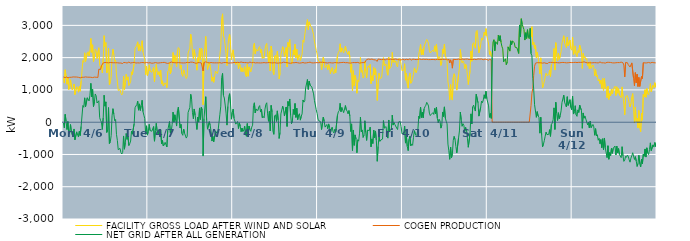
| Category | FACILITY GROSS LOAD AFTER WIND AND SOLAR | COGEN PRODUCTION | NET GRID AFTER ALL GENERATION |
|---|---|---|---|
|  Mon  4/6 | 1372 | 1400 | -28 |
|  Mon  4/6 | 1213 | 1388 | -175 |
|  Mon  4/6 | 1624 | 1382 | 242 |
|  Mon  4/6 | 1410 | 1388 | 22 |
|  Mon  4/6 | 1175 | 1403 | -228 |
|  Mon  4/6 | 1392 | 1372 | 20 |
|  Mon  4/6 | 1013 | 1386 | -373 |
|  Mon  4/6 | 1108 | 1390 | -282 |
|  Mon  4/6 | 1317 | 1389 | -72 |
|  Mon  4/6 | 1077 | 1392 | -315 |
|  Mon  4/6 | 999 | 1400 | -401 |
|  Mon  4/6 | 1069 | 1402 | -333 |
|  Mon  4/6 | 1184 | 1394 | -210 |
|  Mon  4/6 | 854 | 1400 | -546 |
|  Mon  4/6 | 846 | 1378 | -532 |
|  Mon  4/6 | 1100 | 1399 | -299 |
|  Mon  4/6 | 1056 | 1382 | -326 |
|  Mon  4/6 | 930 | 1390 | -460 |
|  Mon  4/6 | 1109 | 1390 | -281 |
|  Mon  4/6 | 960 | 1373 | -413 |
|  Mon  4/6 | 1271 | 1401 | -130 |
|  Mon  4/6 | 1284 | 1393 | -109 |
|  Mon  4/6 | 1911 | 1394 | 517 |
|  Mon  4/6 | 1853 | 1392 | 461 |
|  Mon  4/6 | 2149 | 1394 | 755 |
|  Mon  4/6 | 1881 | 1402 | 479 |
|  Mon  4/6 | 1887 | 1405 | 482 |
|  Mon  4/6 | 2152 | 1395 | 757 |
|  Mon  4/6 | 2183 | 1396 | 787 |
|  Mon  4/6 | 2052 | 1394 | 658 |
|  Mon  4/6 | 2223 | 1388 | 835 |
|  Mon  4/6 | 2595 | 1392 | 1203 |
|  Mon  4/6 | 2164 | 1384 | 780 |
|  Mon  4/6 | 2398 | 1382 | 1016 |
|  Mon  4/6 | 1870 | 1387 | 483 |
|  Mon  4/6 | 2021 | 1397 | 624 |
|  Mon  4/6 | 2260 | 1386 | 874 |
|  Mon  4/6 | 2209 | 1392 | 817 |
|  Mon  4/6 | 1971 | 1377 | 594 |
|  Mon  4/6 | 1960 | 1386 | 574 |
|  Mon  4/6 | 2305 | 1641 | 664 |
|  Mon  4/6 | 1777 | 1638 | 139 |
|  Mon  4/6 | 1690 | 1635 | 55 |
|  Mon  4/6 | 1749 | 1750 | -1 |
|  Mon  4/6 | 1524 | 1747 | -223 |
|  Mon  4/6 | 1975 | 1837 | 138 |
|  Mon  4/6 | 2682 | 1847 | 835 |
|  Mon  4/6 | 2346 | 1850 | 496 |
|  Mon  4/6 | 2466 | 1837 | 629 |
|  Mon  4/6 | 1527 | 1845 | -318 |
|  Mon  4/6 | 1591 | 1835 | -244 |
|  Mon  4/6 | 2292 | 1839 | 453 |
|  Mon  4/6 | 1154 | 1815 | -661 |
|  Mon  4/6 | 1241 | 1850 | -609 |
|  Mon  4/6 | 1406 | 1822 | -416 |
|  Mon  4/6 | 2041 | 1844 | 197 |
|  Mon  4/6 | 2264 | 1846 | 418 |
|  Mon  4/6 | 2090 | 1841 | 249 |
|  Mon  4/6 | 1882 | 1839 | 43 |
|  Mon  4/6 | 1926 | 1842 | 84 |
|  Mon  4/6 | 1467 | 1844 | -377 |
|  Mon  4/6 | 1275 | 1841 | -566 |
|  Mon  4/6 | 983 | 1836 | -853 |
|  Mon  4/6 | 959 | 1834 | -875 |
|  Mon  4/6 | 1013 | 1825 | -812 |
|  Mon  4/6 | 897 | 1833 | -936 |
|  Mon  4/6 | 845 | 1831 | -986 |
|  Mon  4/6 | 880 | 1817 | -937 |
|  Mon  4/6 | 1423 | 1850 | -427 |
|  Mon  4/6 | 1011 | 1848 | -837 |
|  Mon  4/6 | 1221 | 1846 | -625 |
|  Mon  4/6 | 1484 | 1835 | -351 |
|  Mon  4/6 | 1302 | 1833 | -531 |
|  Mon  4/6 | 1405 | 1842 | -437 |
|  Mon  4/6 | 1138 | 1862 | -724 |
|  Mon  4/6 | 1167 | 1833 | -666 |
|  Mon  4/6 | 1250 | 1834 | -584 |
|  Mon  4/6 | 1560 | 1841 | -281 |
|  Mon  4/6 | 1474 | 1845 | -371 |
|  Mon  4/6 | 1490 | 1838 | -348 |
|  Mon  4/6 | 1808 | 1855 | -47 |
|  Mon  4/6 | 2290 | 1841 | 449 |
|  Mon  4/6 | 2335 | 1833 | 502 |
|  Mon  4/6 | 2387 | 1844 | 543 |
|  Mon  4/6 | 2490 | 1839 | 651 |
|  Mon  4/6 | 2220 | 1848 | 372 |
|  Mon  4/6 | 2402 | 1835 | 567 |
|  Mon  4/6 | 2203 | 1841 | 362 |
|  Mon  4/6 | 2363 | 1846 | 517 |
|  Mon  4/6 | 2525 | 1846 | 679 |
|  Mon  4/6 | 2178 | 1849 | 329 |
|  Mon  4/6 | 2056 | 1840 | 216 |
|  Mon  4/6 | 1945 | 1836 | 109 |
|  Mon  4/6 | 1470 | 1845 | -375 |
|  Mon  4/6 | 1737 | 1850 | -113 |
|  Mon  4/6 | 1442 | 1843 | -401 |
|  Tue  4/7 | 1551 | 1837 | -286 |
|  Tue  4/7 | 1779 | 1846 | -67 |
|  Tue  4/7 | 1583 | 1843 | -260 |
|  Tue  4/7 | 1603 | 1855 | -252 |
|  Tue  4/7 | 1546 | 1826 | -280 |
|  Tue  4/7 | 1542 | 1848 | -306 |
|  Tue  4/7 | 1699 | 1833 | -134 |
|  Tue  4/7 | 1252 | 1841 | -589 |
|  Tue  4/7 | 1585 | 1848 | -263 |
|  Tue  4/7 | 1797 | 1833 | -36 |
|  Tue  4/7 | 1554 | 1834 | -280 |
|  Tue  4/7 | 1464 | 1846 | -382 |
|  Tue  4/7 | 1569 | 1835 | -266 |
|  Tue  4/7 | 1423 | 1837 | -414 |
|  Tue  4/7 | 1607 | 1843 | -236 |
|  Tue  4/7 | 1182 | 1847 | -665 |
|  Tue  4/7 | 1282 | 1848 | -566 |
|  Tue  4/7 | 1120 | 1858 | -738 |
|  Tue  4/7 | 1148 | 1854 | -706 |
|  Tue  4/7 | 1219 | 1843 | -624 |
|  Tue  4/7 | 1184 | 1835 | -651 |
|  Tue  4/7 | 1070 | 1839 | -769 |
|  Tue  4/7 | 1569 | 1821 | -252 |
|  Tue  4/7 | 1601 | 1839 | -238 |
|  Tue  4/7 | 1856 | 1836 | 20 |
|  Tue  4/7 | 1502 | 1839 | -337 |
|  Tue  4/7 | 1596 | 1864 | -268 |
|  Tue  4/7 | 1773 | 1839 | -66 |
|  Tue  4/7 | 2159 | 1847 | 312 |
|  Tue  4/7 | 1841 | 1844 | -3 |
|  Tue  4/7 | 2071 | 1842 | 229 |
|  Tue  4/7 | 1910 | 1841 | 69 |
|  Tue  4/7 | 1721 | 1841 | -120 |
|  Tue  4/7 | 2207 | 1846 | 361 |
|  Tue  4/7 | 2312 | 1846 | 466 |
|  Tue  4/7 | 2277 | 1828 | 449 |
|  Tue  4/7 | 1666 | 1842 | -176 |
|  Tue  4/7 | 1770 | 1839 | -69 |
|  Tue  4/7 | 1486 | 1837 | -351 |
|  Tue  4/7 | 1420 | 1827 | -407 |
|  Tue  4/7 | 1622 | 1836 | -214 |
|  Tue  4/7 | 1521 | 1861 | -340 |
|  Tue  4/7 | 1498 | 1838 | -340 |
|  Tue  4/7 | 1353 | 1846 | -493 |
|  Tue  4/7 | 1417 | 1855 | -438 |
|  Tue  4/7 | 2140 | 1842 | 298 |
|  Tue  4/7 | 2145 | 1843 | 302 |
|  Tue  4/7 | 2294 | 1835 | 459 |
|  Tue  4/7 | 2725 | 1861 | 864 |
|  Tue  4/7 | 2548 | 1842 | 706 |
|  Tue  4/7 | 2149 | 1858 | 291 |
|  Tue  4/7 | 1955 | 1847 | 108 |
|  Tue  4/7 | 2252 | 1843 | 409 |
|  Tue  4/7 | 2064 | 1847 | 217 |
|  Tue  4/7 | 1825 | 1823 | 2 |
|  Tue  4/7 | 1611 | 1837 | -226 |
|  Tue  4/7 | 1999 | 1842 | 157 |
|  Tue  4/7 | 1840 | 1839 | 1 |
|  Tue  4/7 | 2287 | 1846 | 441 |
|  Tue  4/7 | 1932 | 1848 | 84 |
|  Tue  4/7 | 2297 | 1836 | 461 |
|  Tue  4/7 | 2218 | 1847 | 371 |
|  Tue  4/7 | 537 | 1587 | -1050 |
|  Tue  4/7 | 1959 | 1848 | 111 |
|  Tue  4/7 | 1943 | 1833 | 110 |
|  Tue  4/7 | 2658 | 1869 | 789 |
|  Tue  4/7 | 1908 | 1846 | 62 |
|  Tue  4/7 | 1631 | 1848 | -217 |
|  Tue  4/7 | 1647 | 1845 | -198 |
|  Tue  4/7 | 1853 | 1837 | 16 |
|  Tue  4/7 | 1743 | 1845 | -102 |
|  Tue  4/7 | 1570 | 1848 | -278 |
|  Tue  4/7 | 1266 | 1851 | -585 |
|  Tue  4/7 | 1401 | 1841 | -440 |
|  Tue  4/7 | 1237 | 1842 | -605 |
|  Tue  4/7 | 1410 | 1839 | -429 |
|  Tue  4/7 | 1583 | 1851 | -268 |
|  Tue  4/7 | 1558 | 1839 | -281 |
|  Tue  4/7 | 1506 | 1863 | -357 |
|  Tue  4/7 | 1593 | 1838 | -245 |
|  Tue  4/7 | 1849 | 1852 | -3 |
|  Tue  4/7 | 2090 | 1844 | 246 |
|  Tue  4/7 | 2335 | 1838 | 497 |
|  Tue  4/7 | 3212 | 1830 | 1382 |
|  Tue  4/7 | 3357 | 1846 | 1511 |
|  Tue  4/7 | 2675 | 1846 | 829 |
|  Tue  4/7 | 2600 | 1851 | 749 |
|  Tue  4/7 | 2379 | 1849 | 530 |
|  Tue  4/7 | 2128 | 1847 | 281 |
|  Tue  4/7 | 1753 | 1844 | -91 |
|  Tue  4/7 | 2319 | 1831 | 488 |
|  Tue  4/7 | 2624 | 1831 | 793 |
|  Tue  4/7 | 2723 | 1840 | 883 |
|  Tue  4/7 | 2405 | 1838 | 567 |
|  Tue  4/7 | 1934 | 1842 | 92 |
|  Tue  4/7 | 2146 | 1838 | 308 |
|  Wed  4/8 | 2242 | 1836 | 406 |
|  Wed  4/8 | 1967 | 1851 | 116 |
|  Wed  4/8 | 1877 | 1848 | 29 |
|  Wed  4/8 | 1787 | 1848 | -61 |
|  Wed  4/8 | 1836 | 1855 | -19 |
|  Wed  4/8 | 1873 | 1851 | 22 |
|  Wed  4/8 | 1651 | 1848 | -197 |
|  Wed  4/8 | 1829 | 1849 | -20 |
|  Wed  4/8 | 1738 | 1861 | -123 |
|  Wed  4/8 | 1569 | 1864 | -295 |
|  Wed  4/8 | 1686 | 1868 | -182 |
|  Wed  4/8 | 1561 | 1849 | -288 |
|  Wed  4/8 | 1606 | 1847 | -241 |
|  Wed  4/8 | 1721 | 1846 | -125 |
|  Wed  4/8 | 1466 | 1828 | -362 |
|  Wed  4/8 | 1408 | 1845 | -437 |
|  Wed  4/8 | 1806 | 1848 | -42 |
|  Wed  4/8 | 1424 | 1835 | -411 |
|  Wed  4/8 | 1713 | 1831 | -118 |
|  Wed  4/8 | 1633 | 1863 | -230 |
|  Wed  4/8 | 1557 | 1841 | -284 |
|  Wed  4/8 | 1689 | 1841 | -152 |
|  Wed  4/8 | 1759 | 1851 | -92 |
|  Wed  4/8 | 2367 | 1852 | 515 |
|  Wed  4/8 | 2443 | 1842 | 601 |
|  Wed  4/8 | 2121 | 1836 | 285 |
|  Wed  4/8 | 2255 | 1849 | 406 |
|  Wed  4/8 | 2268 | 1841 | 427 |
|  Wed  4/8 | 2207 | 1846 | 361 |
|  Wed  4/8 | 2308 | 1838 | 470 |
|  Wed  4/8 | 2345 | 1831 | 514 |
|  Wed  4/8 | 2150 | 1836 | 314 |
|  Wed  4/8 | 2267 | 1864 | 403 |
|  Wed  4/8 | 1978 | 1840 | 138 |
|  Wed  4/8 | 2020 | 1844 | 176 |
|  Wed  4/8 | 1981 | 1847 | 134 |
|  Wed  4/8 | 2248 | 1844 | 404 |
|  Wed  4/8 | 2390 | 1838 | 552 |
|  Wed  4/8 | 2440 | 1838 | 602 |
|  Wed  4/8 | 2101 | 1844 | 257 |
|  Wed  4/8 | 1864 | 1837 | 27 |
|  Wed  4/8 | 2185 | 1848 | 337 |
|  Wed  4/8 | 1586 | 1859 | -273 |
|  Wed  4/8 | 2359 | 1839 | 520 |
|  Wed  4/8 | 2169 | 1848 | 321 |
|  Wed  4/8 | 1562 | 1837 | -275 |
|  Wed  4/8 | 1476 | 1852 | -376 |
|  Wed  4/8 | 2038 | 1844 | 194 |
|  Wed  4/8 | 2075 | 1846 | 229 |
|  Wed  4/8 | 1855 | 1832 | 23 |
|  Wed  4/8 | 2197 | 1847 | 350 |
|  Wed  4/8 | 1895 | 1831 | 64 |
|  Wed  4/8 | 1343 | 1847 | -504 |
|  Wed  4/8 | 1518 | 1839 | -321 |
|  Wed  4/8 | 2094 | 1837 | 257 |
|  Wed  4/8 | 2078 | 1838 | 240 |
|  Wed  4/8 | 2337 | 1842 | 495 |
|  Wed  4/8 | 2246 | 1860 | 386 |
|  Wed  4/8 | 2027 | 1836 | 191 |
|  Wed  4/8 | 2033 | 1849 | 184 |
|  Wed  4/8 | 2313 | 1842 | 471 |
|  Wed  4/8 | 1712 | 1844 | -132 |
|  Wed  4/8 | 2471 | 1829 | 642 |
|  Wed  4/8 | 2337 | 1832 | 505 |
|  Wed  4/8 | 2560 | 1841 | 719 |
|  Wed  4/8 | 2052 | 1827 | 225 |
|  Wed  4/8 | 1801 | 1846 | -45 |
|  Wed  4/8 | 1873 | 1842 | 31 |
|  Wed  4/8 | 2236 | 1838 | 398 |
|  Wed  4/8 | 2080 | 1842 | 238 |
|  Wed  4/8 | 2415 | 1836 | 579 |
|  Wed  4/8 | 1996 | 1849 | 147 |
|  Wed  4/8 | 2262 | 1831 | 431 |
|  Wed  4/8 | 1921 | 1842 | 79 |
|  Wed  4/8 | 2061 | 1846 | 215 |
|  Wed  4/8 | 2094 | 1831 | 263 |
|  Wed  4/8 | 1905 | 1842 | 63 |
|  Wed  4/8 | 2021 | 1837 | 184 |
|  Wed  4/8 | 2106 | 1848 | 258 |
|  Wed  4/8 | 2536 | 1848 | 688 |
|  Wed  4/8 | 2477 | 1855 | 622 |
|  Wed  4/8 | 2497 | 1833 | 664 |
|  Wed  4/8 | 2902 | 1841 | 1061 |
|  Wed  4/8 | 2914 | 1839 | 1075 |
|  Wed  4/8 | 3178 | 1856 | 1322 |
|  Wed  4/8 | 2864 | 1848 | 1016 |
|  Wed  4/8 | 3110 | 1839 | 1271 |
|  Wed  4/8 | 3010 | 1860 | 1150 |
|  Wed  4/8 | 2993 | 1849 | 1144 |
|  Wed  4/8 | 2926 | 1838 | 1088 |
|  Wed  4/8 | 2931 | 1833 | 1098 |
|  Wed  4/8 | 2714 | 1837 | 877 |
|  Wed  4/8 | 2496 | 1827 | 669 |
|  Wed  4/8 | 2526 | 1842 | 684 |
|  Wed  4/8 | 2228 | 1843 | 385 |
|  Wed  4/8 | 2114 | 1846 | 268 |
|  Thu  4/9 | 1946 | 1851 | 95 |
|  Thu  4/9 | 1883 | 1842 | 41 |
|  Thu  4/9 | 1905 | 1869 | 36 |
|  Thu  4/9 | 1869 | 1856 | 13 |
|  Thu  4/9 | 1626 | 1854 | -228 |
|  Thu  4/9 | 1638 | 1858 | -220 |
|  Thu  4/9 | 2014 | 1856 | 158 |
|  Thu  4/9 | 1873 | 1846 | 27 |
|  Thu  4/9 | 1687 | 1841 | -154 |
|  Thu  4/9 | 1704 | 1840 | -136 |
|  Thu  4/9 | 1773 | 1844 | -71 |
|  Thu  4/9 | 1630 | 1834 | -204 |
|  Thu  4/9 | 1790 | 1844 | -54 |
|  Thu  4/9 | 1693 | 1845 | -152 |
|  Thu  4/9 | 1505 | 1852 | -347 |
|  Thu  4/9 | 1624 | 1839 | -215 |
|  Thu  4/9 | 1696 | 1848 | -152 |
|  Thu  4/9 | 1551 | 1834 | -283 |
|  Thu  4/9 | 1500 | 1834 | -334 |
|  Thu  4/9 | 1631 | 1848 | -217 |
|  Thu  4/9 | 1531 | 1837 | -306 |
|  Thu  4/9 | 1552 | 1843 | -291 |
|  Thu  4/9 | 2059 | 1844 | 215 |
|  Thu  4/9 | 2161 | 1838 | 323 |
|  Thu  4/9 | 2204 | 1845 | 359 |
|  Thu  4/9 | 2429 | 1844 | 585 |
|  Thu  4/9 | 2169 | 1843 | 326 |
|  Thu  4/9 | 2304 | 1849 | 455 |
|  Thu  4/9 | 2305 | 1851 | 454 |
|  Thu  4/9 | 2149 | 1854 | 295 |
|  Thu  4/9 | 2133 | 1850 | 283 |
|  Thu  4/9 | 2358 | 1843 | 515 |
|  Thu  4/9 | 2204 | 1825 | 379 |
|  Thu  4/9 | 2190 | 1845 | 345 |
|  Thu  4/9 | 2095 | 1840 | 255 |
|  Thu  4/9 | 2197 | 1835 | 362 |
|  Thu  4/9 | 2020 | 1827 | 193 |
|  Thu  4/9 | 1543 | 1832 | -289 |
|  Thu  4/9 | 1806 | 1858 | -52 |
|  Thu  4/9 | 969 | 1845 | -876 |
|  Thu  4/9 | 1596 | 1838 | -242 |
|  Thu  4/9 | 1129 | 1847 | -718 |
|  Thu  4/9 | 1449 | 1843 | -394 |
|  Thu  4/9 | 1322 | 1844 | -522 |
|  Thu  4/9 | 896 | 1842 | -946 |
|  Thu  4/9 | 1308 | 1852 | -544 |
|  Thu  4/9 | 1253 | 1840 | -587 |
|  Thu  4/9 | 1491 | 1831 | -340 |
|  Thu  4/9 | 2002 | 1846 | 156 |
|  Thu  4/9 | 1548 | 1843 | -295 |
|  Thu  4/9 | 1607 | 1847 | -240 |
|  Thu  4/9 | 1374 | 1846 | -472 |
|  Thu  4/9 | 1440 | 1841 | -401 |
|  Thu  4/9 | 1890 | 1846 | 44 |
|  Thu  4/9 | 1581 | 1901 | -320 |
|  Thu  4/9 | 1375 | 1940 | -565 |
|  Thu  4/9 | 1697 | 1941 | -244 |
|  Thu  4/9 | 1743 | 1957 | -214 |
|  Thu  4/9 | 1689 | 1950 | -261 |
|  Thu  4/9 | 1793 | 1946 | -153 |
|  Thu  4/9 | 1196 | 1959 | -763 |
|  Thu  4/9 | 1437 | 1956 | -519 |
|  Thu  4/9 | 1285 | 1946 | -661 |
|  Thu  4/9 | 1692 | 1935 | -243 |
|  Thu  4/9 | 1461 | 1945 | -484 |
|  Thu  4/9 | 1656 | 1928 | -272 |
|  Thu  4/9 | 1360 | 1924 | -564 |
|  Thu  4/9 | 673 | 1885 | -1212 |
|  Thu  4/9 | 1206 | 1957 | -751 |
|  Thu  4/9 | 1515 | 1955 | -440 |
|  Thu  4/9 | 1354 | 1947 | -593 |
|  Thu  4/9 | 1382 | 1936 | -554 |
|  Thu  4/9 | 1380 | 1938 | -558 |
|  Thu  4/9 | 1410 | 1934 | -524 |
|  Thu  4/9 | 1998 | 1949 | 49 |
|  Thu  4/9 | 1755 | 1940 | -185 |
|  Thu  4/9 | 1771 | 1931 | -160 |
|  Thu  4/9 | 1794 | 1930 | -136 |
|  Thu  4/9 | 1551 | 1959 | -408 |
|  Thu  4/9 | 1455 | 1949 | -494 |
|  Thu  4/9 | 2014 | 1946 | 68 |
|  Thu  4/9 | 1658 | 1946 | -288 |
|  Thu  4/9 | 1677 | 1954 | -277 |
|  Thu  4/9 | 1734 | 1928 | -194 |
|  Thu  4/9 | 2162 | 1944 | 218 |
|  Thu  4/9 | 1854 | 1944 | -90 |
|  Thu  4/9 | 1937 | 1950 | -13 |
|  Thu  4/9 | 1855 | 1931 | -76 |
|  Thu  4/9 | 1896 | 1957 | -61 |
|  Thu  4/9 | 1753 | 1935 | -182 |
|  Thu  4/9 | 1713 | 1941 | -228 |
|  Thu  4/9 | 1962 | 1960 | 2 |
|  Thu  4/9 | 1959 | 1933 | 26 |
|  Thu  4/9 | 1963 | 1942 | 21 |
|  Thu  4/9 | 1794 | 1928 | -134 |
|  Thu  4/9 | 1594 | 1955 | -361 |
|  Fri  4/10 | 1611 | 1953 | -342 |
|  Fri  4/10 | 1619 | 1953 | -334 |
|  Fri  4/10 | 1810 | 1931 | -121 |
|  Fri  4/10 | 1302 | 1950 | -648 |
|  Fri  4/10 | 1509 | 1949 | -440 |
|  Fri  4/10 | 1190 | 1945 | -755 |
|  Fri  4/10 | 1055 | 1935 | -880 |
|  Fri  4/10 | 1411 | 1940 | -529 |
|  Fri  4/10 | 1527 | 1961 | -434 |
|  Fri  4/10 | 1204 | 1939 | -735 |
|  Fri  4/10 | 1239 | 1921 | -682 |
|  Fri  4/10 | 1240 | 1957 | -717 |
|  Fri  4/10 | 1473 | 1941 | -468 |
|  Fri  4/10 | 1683 | 1946 | -263 |
|  Fri  4/10 | 1588 | 1948 | -360 |
|  Fri  4/10 | 1525 | 1939 | -414 |
|  Fri  4/10 | 1553 | 1931 | -378 |
|  Fri  4/10 | 1717 | 1946 | -229 |
|  Fri  4/10 | 2102 | 1917 | 185 |
|  Fri  4/10 | 2076 | 1958 | 118 |
|  Fri  4/10 | 2407 | 1937 | 470 |
|  Fri  4/10 | 2085 | 1942 | 143 |
|  Fri  4/10 | 2249 | 1942 | 307 |
|  Fri  4/10 | 2087 | 1952 | 135 |
|  Fri  4/10 | 2347 | 1935 | 412 |
|  Fri  4/10 | 2425 | 1946 | 479 |
|  Fri  4/10 | 2446 | 1922 | 524 |
|  Fri  4/10 | 2563 | 1949 | 614 |
|  Fri  4/10 | 2507 | 1936 | 571 |
|  Fri  4/10 | 2439 | 1939 | 500 |
|  Fri  4/10 | 2220 | 1941 | 279 |
|  Fri  4/10 | 2144 | 1939 | 205 |
|  Fri  4/10 | 2183 | 1943 | 240 |
|  Fri  4/10 | 2195 | 1945 | 250 |
|  Fri  4/10 | 2230 | 1934 | 296 |
|  Fri  4/10 | 2181 | 1941 | 240 |
|  Fri  4/10 | 2365 | 1938 | 427 |
|  Fri  4/10 | 2196 | 1936 | 260 |
|  Fri  4/10 | 2410 | 1949 | 461 |
|  Fri  4/10 | 2068 | 1950 | 118 |
|  Fri  4/10 | 1923 | 1941 | -18 |
|  Fri  4/10 | 2028 | 1941 | 87 |
|  Fri  4/10 | 1993 | 1955 | 38 |
|  Fri  4/10 | 1758 | 1942 | -184 |
|  Fri  4/10 | 1860 | 1955 | -95 |
|  Fri  4/10 | 2266 | 1950 | 316 |
|  Fri  4/10 | 2129 | 1954 | 175 |
|  Fri  4/10 | 2417 | 1943 | 474 |
|  Fri  4/10 | 2056 | 1925 | 131 |
|  Fri  4/10 | 1982 | 1953 | 29 |
|  Fri  4/10 | 1877 | 1929 | -52 |
|  Fri  4/10 | 1247 | 1925 | -678 |
|  Fri  4/10 | 1072 | 1957 | -885 |
|  Fri  4/10 | 684 | 1835 | -1151 |
|  Fri  4/10 | 1163 | 1933 | -770 |
|  Fri  4/10 | 765 | 1867 | -1102 |
|  Fri  4/10 | 684 | 1674 | -990 |
|  Fri  4/10 | 1389 | 1948 | -559 |
|  Fri  4/10 | 1501 | 1942 | -441 |
|  Fri  4/10 | 1405 | 1942 | -537 |
|  Fri  4/10 | 1185 | 1941 | -756 |
|  Fri  4/10 | 993 | 1943 | -950 |
|  Fri  4/10 | 1016 | 1947 | -931 |
|  Fri  4/10 | 1467 | 1954 | -487 |
|  Fri  4/10 | 1681 | 1952 | -271 |
|  Fri  4/10 | 2253 | 1940 | 313 |
|  Fri  4/10 | 1992 | 1918 | 74 |
|  Fri  4/10 | 1832 | 1958 | -126 |
|  Fri  4/10 | 1898 | 1948 | -50 |
|  Fri  4/10 | 1849 | 1948 | -99 |
|  Fri  4/10 | 1657 | 1946 | -289 |
|  Fri  4/10 | 1795 | 1954 | -159 |
|  Fri  4/10 | 1707 | 1945 | -238 |
|  Fri  4/10 | 1462 | 1957 | -495 |
|  Fri  4/10 | 1167 | 1944 | -777 |
|  Fri  4/10 | 1168 | 1940 | -772 |
|  Fri  4/10 | 1600 | 1942 | -342 |
|  Fri  4/10 | 2208 | 1950 | 258 |
|  Fri  4/10 | 1888 | 1944 | -56 |
|  Fri  4/10 | 2414 | 1943 | 471 |
|  Fri  4/10 | 2465 | 1937 | 528 |
|  Fri  4/10 | 2449 | 1950 | 499 |
|  Fri  4/10 | 2293 | 1948 | 345 |
|  Fri  4/10 | 2803 | 1940 | 863 |
|  Fri  4/10 | 2845 | 1961 | 884 |
|  Fri  4/10 | 2561 | 1960 | 601 |
|  Fri  4/10 | 2148 | 1960 | 188 |
|  Fri  4/10 | 2129 | 1954 | 175 |
|  Fri  4/10 | 2398 | 1937 | 461 |
|  Fri  4/10 | 2610 | 1958 | 652 |
|  Fri  4/10 | 2543 | 1939 | 604 |
|  Fri  4/10 | 2626 | 1936 | 690 |
|  Fri  4/10 | 2786 | 1936 | 850 |
|  Fri  4/10 | 2692 | 1955 | 737 |
|  Fri  4/10 | 2898 | 1940 | 958 |
|  Fri  4/10 | 2667 | 1941 | 726 |
|  Sat  4/11 | 2669 | 1951 | 718 |
|  Sat  4/11 | 2423 | 1918 | 505 |
|  Sat  4/11 | 2100 | 1950 | 150 |
|  Sat  4/11 | 2204 | 1935 | 269 |
|  Sat  4/11 | 2048 | 1929 | 119 |
|  Sat  4/11 | 2011 | 0 | 2011 |
|  Sat  4/11 | 2480 | 0 | 2480 |
|  Sat  4/11 | 2555 | 0 | 2555 |
|  Sat  4/11 | 2216 | 0 | 2216 |
|  Sat  4/11 | 2492 | 0 | 2492 |
|  Sat  4/11 | 2500 | 0 | 2500 |
|  Sat  4/11 | 2410 | 0 | 2410 |
|  Sat  4/11 | 2696 | 0 | 2696 |
|  Sat  4/11 | 2523 | 0 | 2523 |
|  Sat  4/11 | 2680 | 0 | 2680 |
|  Sat  4/11 | 2482 | 0 | 2482 |
|  Sat  4/11 | 2352 | 0 | 2352 |
|  Sat  4/11 | 2272 | 0 | 2272 |
|  Sat  4/11 | 1867 | 0 | 1867 |
|  Sat  4/11 | 1922 | 0 | 1922 |
|  Sat  4/11 | 1964 | 0 | 1964 |
|  Sat  4/11 | 1782 | 0 | 1782 |
|  Sat  4/11 | 1861 | 0 | 1861 |
|  Sat  4/11 | 2334 | 0 | 2334 |
|  Sat  4/11 | 2343 | 0 | 2343 |
|  Sat  4/11 | 2203 | 0 | 2203 |
|  Sat  4/11 | 2521 | 0 | 2521 |
|  Sat  4/11 | 2404 | 0 | 2404 |
|  Sat  4/11 | 2516 | 0 | 2516 |
|  Sat  4/11 | 2540 | 0 | 2540 |
|  Sat  4/11 | 2466 | 0 | 2466 |
|  Sat  4/11 | 2321 | 0 | 2321 |
|  Sat  4/11 | 2348 | 0 | 2348 |
|  Sat  4/11 | 2307 | 0 | 2307 |
|  Sat  4/11 | 2308 | 0 | 2308 |
|  Sat  4/11 | 2130 | 0 | 2130 |
|  Sat  4/11 | 3012 | 0 | 3012 |
|  Sat  4/11 | 2649 | 0 | 2649 |
|  Sat  4/11 | 3205 | 0 | 3205 |
|  Sat  4/11 | 3034 | 0 | 3034 |
|  Sat  4/11 | 3014 | 0 | 3014 |
|  Sat  4/11 | 2867 | 0 | 2867 |
|  Sat  4/11 | 2545 | 0 | 2545 |
|  Sat  4/11 | 2774 | 0 | 2774 |
|  Sat  4/11 | 2595 | 0 | 2595 |
|  Sat  4/11 | 2866 | 0 | 2866 |
|  Sat  4/11 | 2623 | 0 | 2623 |
|  Sat  4/11 | 2586 | 0 | 2586 |
|  Sat  4/11 | 2907 | 0 | 2907 |
|  Sat  4/11 | 2644 | 519 | 2125 |
|  Sat  4/11 | 2958 | 899 | 2059 |
|  Sat  4/11 | 2403 | 1045 | 1358 |
|  Sat  4/11 | 2477 | 1448 | 1029 |
|  Sat  4/11 | 2273 | 1732 | 541 |
|  Sat  4/11 | 2391 | 1828 | 563 |
|  Sat  4/11 | 2003 | 1852 | 151 |
|  Sat  4/11 | 2171 | 1844 | 327 |
|  Sat  4/11 | 2013 | 1822 | 191 |
|  Sat  4/11 | 1993 | 1842 | 151 |
|  Sat  4/11 | 1496 | 1837 | -341 |
|  Sat  4/11 | 1993 | 1840 | 153 |
|  Sat  4/11 | 1462 | 1854 | -392 |
|  Sat  4/11 | 1066 | 1830 | -764 |
|  Sat  4/11 | 1158 | 1843 | -685 |
|  Sat  4/11 | 1270 | 1841 | -571 |
|  Sat  4/11 | 1403 | 1838 | -435 |
|  Sat  4/11 | 1520 | 1824 | -304 |
|  Sat  4/11 | 1446 | 1832 | -386 |
|  Sat  4/11 | 1427 | 1819 | -392 |
|  Sat  4/11 | 1474 | 1851 | -377 |
|  Sat  4/11 | 1615 | 1846 | -231 |
|  Sat  4/11 | 1414 | 1853 | -439 |
|  Sat  4/11 | 1772 | 1843 | -71 |
|  Sat  4/11 | 1826 | 1851 | -25 |
|  Sat  4/11 | 1915 | 1839 | 76 |
|  Sat  4/11 | 2285 | 1841 | 444 |
|  Sat  4/11 | 1615 | 1840 | -225 |
|  Sat  4/11 | 2464 | 1847 | 617 |
|  Sat  4/11 | 2125 | 1852 | 273 |
|  Sat  4/11 | 1895 | 1843 | 52 |
|  Sat  4/11 | 2139 | 1846 | 293 |
|  Sat  4/11 | 1949 | 1839 | 110 |
|  Sat  4/11 | 2046 | 1843 | 203 |
|  Sat  4/11 | 2198 | 1846 | 352 |
|  Sat  4/11 | 2451 | 1844 | 607 |
|  Sat  4/11 | 2443 | 1852 | 591 |
|  Sat  4/11 | 2678 | 1841 | 837 |
|  Sat  4/11 | 2461 | 1846 | 615 |
|  Sat  4/11 | 2381 | 1842 | 539 |
|  Sat  4/11 | 2310 | 1839 | 471 |
|  Sat  4/11 | 2639 | 1850 | 789 |
|  Sat  4/11 | 2362 | 1842 | 520 |
|  Sat  4/11 | 2354 | 1858 | 496 |
|  Sat  4/11 | 2546 | 1850 | 696 |
|  Sat  4/11 | 2282 | 1829 | 453 |
|  Sat  4/11 | 2231 | 1846 | 385 |
|  Sun  4/12 | 2635 | 1831 | 804 |
|  Sun  4/12 | 2101 | 1849 | 252 |
|  Sun  4/12 | 2170 | 1846 | 324 |
|  Sun  4/12 | 2364 | 1854 | 510 |
|  Sun  4/12 | 2090 | 1860 | 230 |
|  Sun  4/12 | 2026 | 1846 | 180 |
|  Sun  4/12 | 2221 | 1841 | 380 |
|  Sun  4/12 | 2156 | 1854 | 302 |
|  Sun  4/12 | 2388 | 1858 | 530 |
|  Sun  4/12 | 2376 | 1852 | 524 |
|  Sun  4/12 | 2196 | 1833 | 363 |
|  Sun  4/12 | 1667 | 1856 | -189 |
|  Sun  4/12 | 2129 | 1843 | 286 |
|  Sun  4/12 | 1994 | 1871 | 123 |
|  Sun  4/12 | 2034 | 1841 | 193 |
|  Sun  4/12 | 1942 | 1848 | 94 |
|  Sun  4/12 | 1973 | 1853 | 120 |
|  Sun  4/12 | 1756 | 1838 | -82 |
|  Sun  4/12 | 1846 | 1840 | 6 |
|  Sun  4/12 | 1663 | 1843 | -180 |
|  Sun  4/12 | 1873 | 1840 | 33 |
|  Sun  4/12 | 1666 | 1838 | -172 |
|  Sun  4/12 | 1665 | 1830 | -165 |
|  Sun  4/12 | 1770 | 1841 | -71 |
|  Sun  4/12 | 1695 | 1839 | -144 |
|  Sun  4/12 | 1441 | 1845 | -404 |
|  Sun  4/12 | 1631 | 1832 | -201 |
|  Sun  4/12 | 1413 | 1841 | -428 |
|  Sun  4/12 | 1463 | 1851 | -388 |
|  Sun  4/12 | 1276 | 1836 | -560 |
|  Sun  4/12 | 1334 | 1834 | -500 |
|  Sun  4/12 | 1198 | 1866 | -668 |
|  Sun  4/12 | 1304 | 1843 | -539 |
|  Sun  4/12 | 1050 | 1839 | -789 |
|  Sun  4/12 | 1348 | 1861 | -513 |
|  Sun  4/12 | 985 | 1840 | -855 |
|  Sun  4/12 | 1353 | 1843 | -490 |
|  Sun  4/12 | 1040 | 1831 | -791 |
|  Sun  4/12 | 1074 | 1836 | -762 |
|  Sun  4/12 | 756 | 1854 | -1098 |
|  Sun  4/12 | 1116 | 1846 | -730 |
|  Sun  4/12 | 706 | 1855 | -1149 |
|  Sun  4/12 | 892 | 1832 | -940 |
|  Sun  4/12 | 814 | 1850 | -1036 |
|  Sun  4/12 | 1030 | 1842 | -812 |
|  Sun  4/12 | 873 | 1839 | -966 |
|  Sun  4/12 | 1022 | 1828 | -806 |
|  Sun  4/12 | 1049 | 1836 | -787 |
|  Sun  4/12 | 1113 | 1852 | -739 |
|  Sun  4/12 | 825 | 1842 | -1017 |
|  Sun  4/12 | 1096 | 1838 | -742 |
|  Sun  4/12 | 899 | 1847 | -948 |
|  Sun  4/12 | 1040 | 1858 | -818 |
|  Sun  4/12 | 843 | 1846 | -1003 |
|  Sun  4/12 | 820 | 1839 | -1019 |
|  Sun  4/12 | 761 | 1860 | -1099 |
|  Sun  4/12 | 1093 | 1853 | -760 |
|  Sun  4/12 | 797 | 1841 | -1044 |
|  Sun  4/12 | 556 | 1770 | -1214 |
|  Sun  4/12 | 229 | 1403 | -1174 |
|  Sun  4/12 | 791 | 1847 | -1056 |
|  Sun  4/12 | 764 | 1853 | -1089 |
|  Sun  4/12 | 823 | 1844 | -1021 |
|  Sun  4/12 | 721 | 1781 | -1060 |
|  Sun  4/12 | 586 | 1752 | -1166 |
|  Sun  4/12 | 470 | 1709 | -1239 |
|  Sun  4/12 | 572 | 1685 | -1113 |
|  Sun  4/12 | 793 | 1837 | -1044 |
|  Sun  4/12 | 885 | 1832 | -947 |
|  Sun  4/12 | 393 | 1358 | -965 |
|  Sun  4/12 | -26 | 1129 | -1155 |
|  Sun  4/12 | 471 | 1536 | -1065 |
|  Sun  4/12 | 14 | 1219 | -1205 |
|  Sun  4/12 | 117 | 1488 | -1371 |
|  Sun  4/12 | -174 | 1106 | -1280 |
|  Sun  4/12 | 362 | 1388 | -1026 |
|  Sun  4/12 | -181 | 1108 | -1289 |
|  Sun  4/12 | -300 | 1086 | -1386 |
|  Sun  4/12 | 271 | 1418 | -1147 |
|  Sun  4/12 | 63 | 1350 | -1287 |
|  Sun  4/12 | 857 | 1844 | -987 |
|  Sun  4/12 | 787 | 1843 | -1056 |
|  Sun  4/12 | 1006 | 1836 | -830 |
|  Sun  4/12 | 772 | 1853 | -1081 |
|  Sun  4/12 | 1043 | 1837 | -794 |
|  Sun  4/12 | 885 | 1834 | -949 |
|  Sun  4/12 | 847 | 1851 | -1004 |
|  Sun  4/12 | 999 | 1846 | -847 |
|  Sun  4/12 | 1194 | 1834 | -640 |
|  Sun  4/12 | 944 | 1824 | -880 |
|  Sun  4/12 | 955 | 1854 | -899 |
|  Sun  4/12 | 1142 | 1844 | -702 |
|  Sun  4/12 | 1071 | 1842 | -771 |
|  Sun  4/12 | 1226 | 1856 | -630 |
|  Sun  4/12 | 1084 | 1838 | -754 |
|  Sun  4/12 | 1239 | 1843 | -604 |